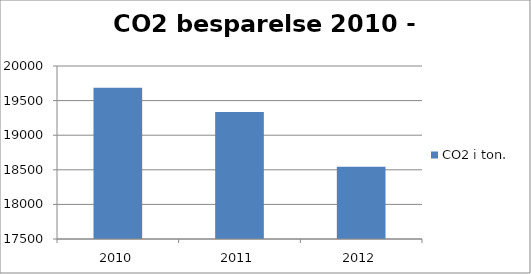
| Category | CO2 i ton.  |
|---|---|
| 2010.0 | 19686 |
| 2011.0 | 19334 |
| 2012.0 | 18543 |